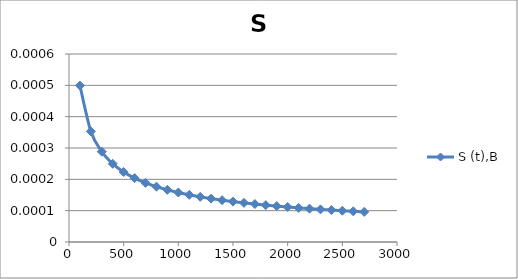
| Category | S (t),В |
|---|---|
| 100.0 | 0 |
| 200.0 | 0 |
| 300.0 | 0 |
| 400.0 | 0 |
| 500.0 | 0 |
| 600.0 | 0 |
| 700.0 | 0 |
| 800.0 | 0 |
| 900.0 | 0 |
| 1000.0 | 0 |
| 1100.0 | 0 |
| 1200.0 | 0 |
| 1300.0 | 0 |
| 1400.0 | 0 |
| 1500.0 | 0 |
| 1600.0 | 0 |
| 1700.0 | 0 |
| 1800.0 | 0 |
| 1900.0 | 0 |
| 2000.0 | 0 |
| 2100.0 | 0 |
| 2200.0 | 0 |
| 2300.0 | 0 |
| 2400.0 | 0 |
| 2500.0 | 0 |
| 2600.0 | 0 |
| 2700.0 | 0 |